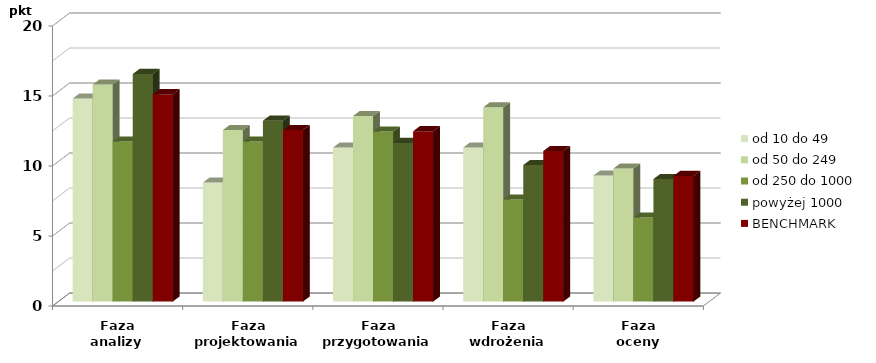
| Category | od 10 do 49 | od 50 do 249 | od 250 do 1000 | powyżej 1000 | BENCHMARK |
|---|---|---|---|---|---|
| Faza
analizy | 14.5 | 15.5 | 11.429 | 16.25 | 14.806 |
| Faza
projektowania | 8.5 | 12.25 | 11.429 | 12.917 | 12.25 |
| Faza
przygotowania | 11 | 13.25 | 12.143 | 11.333 | 12.167 |
| Faza
wdrożenia | 11 | 13.875 | 7.286 | 9.75 | 10.75 |
| Faza
oceny | 9 | 9.5 | 6 | 8.75 | 8.972 |